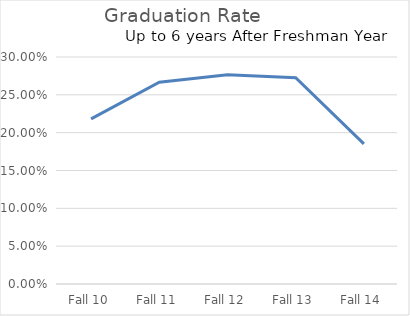
| Category | Retention Rate Percentage |
|---|---|
| Fall 10 | 21.82 |
| Fall 11 | 26.67 |
| Fall 12 | 27.66 |
| Fall 13 | 27.27 |
| Fall 14 | 18.52 |